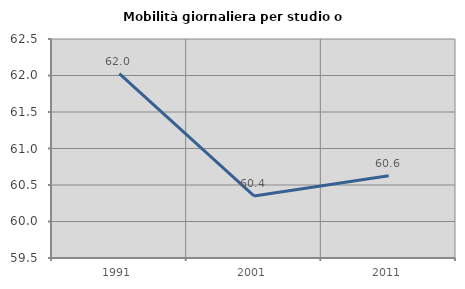
| Category | Mobilità giornaliera per studio o lavoro |
|---|---|
| 1991.0 | 62.025 |
| 2001.0 | 60.35 |
| 2011.0 | 60.628 |